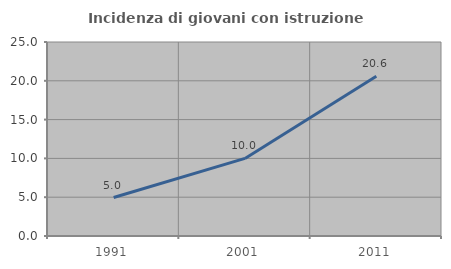
| Category | Incidenza di giovani con istruzione universitaria |
|---|---|
| 1991.0 | 4.959 |
| 2001.0 | 10 |
| 2011.0 | 20.588 |